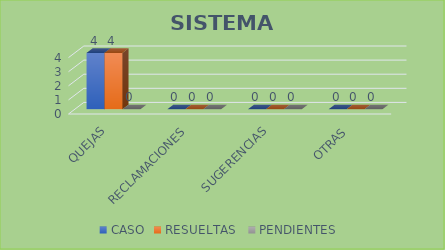
| Category | CASO | RESUELTAS  | PENDIENTES  |
|---|---|---|---|
| QUEJAS | 4 | 4 | 0 |
| RECLAMACIONES | 0 | 0 | 0 |
| SUGERENCIAS | 0 | 0 | 0 |
| OTRAS | 0 | 0 | 0 |